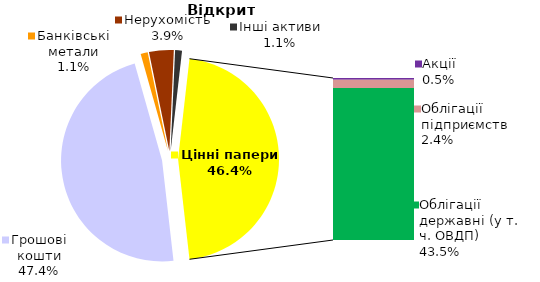
| Category | Відкриті |
|---|---|
| Грошові кошти | 379577268.49 |
| Банківські метали | 9108891.97 |
| Нерухомість | 31594032 |
| Інші активи | 8798923.44 |
| Акції | 3762237.791 |
| Облігації підприємств | 19325214.881 |
| Муніципальні облігації | 0 |
| Облігації державні (у т. ч. ОВДП) | 348213651.981 |